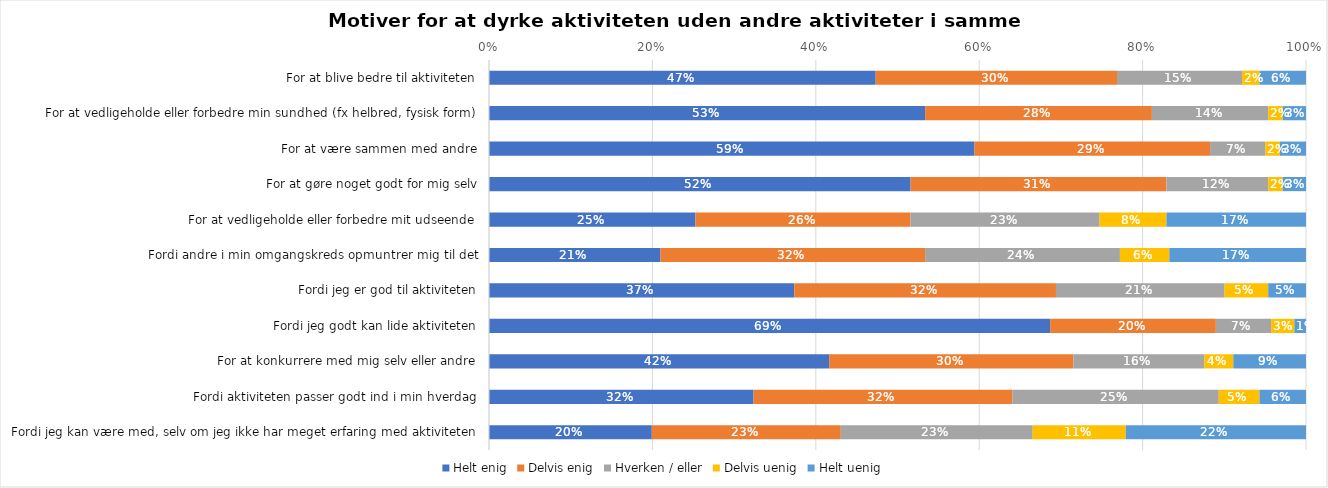
| Category | Helt enig | Delvis enig | Hverken / eller | Delvis uenig | Helt uenig |
|---|---|---|---|---|---|
| For at blive bedre til aktiviteten | 0.473 | 0.295 | 0.153 | 0.021 | 0.057 |
| For at vedligeholde eller forbedre min sundhed (fx helbred, fysisk form) | 0.534 | 0.278 | 0.142 | 0.018 | 0.028 |
| For at være sammen med andre | 0.594 | 0.288 | 0.068 | 0.018 | 0.032 |
| For at gøre noget godt for mig selv | 0.516 | 0.313 | 0.125 | 0.018 | 0.028 |
| For at vedligeholde eller forbedre mit udseende | 0.253 | 0.263 | 0.231 | 0.082 | 0.171 |
| Fordi andre i min omgangskreds opmuntrer mig til det | 0.21 | 0.324 | 0.238 | 0.06 | 0.167 |
| Fordi jeg er god til aktiviteten | 0.374 | 0.32 | 0.206 | 0.053 | 0.046 |
| Fordi jeg godt kan lide aktiviteten | 0.687 | 0.203 | 0.068 | 0.028 | 0.014 |
| For at konkurrere med mig selv eller andre | 0.416 | 0.299 | 0.16 | 0.036 | 0.089 |
| Fordi aktiviteten passer godt ind i min hverdag | 0.324 | 0.317 | 0.253 | 0.05 | 0.057 |
| Fordi jeg kan være med, selv om jeg ikke har meget erfaring med aktiviteten | 0.199 | 0.231 | 0.235 | 0.114 | 0.221 |